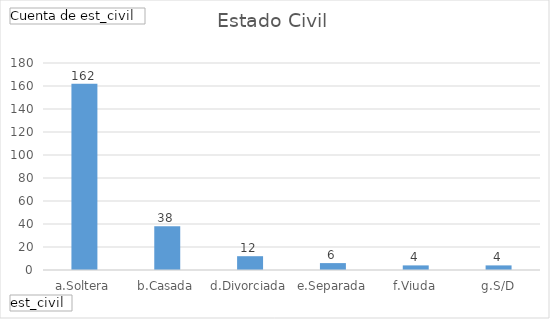
| Category | Total |
|---|---|
| a.Soltera | 162 |
| b.Casada | 38 |
| d.Divorciada | 12 |
| e.Separada | 6 |
| f.Viuda | 4 |
| g.S/D | 4 |